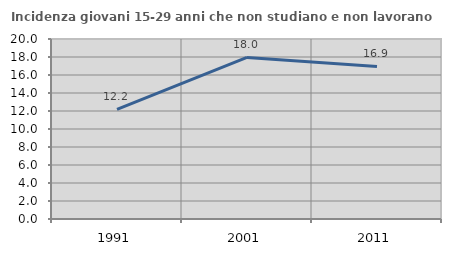
| Category | Incidenza giovani 15-29 anni che non studiano e non lavorano  |
|---|---|
| 1991.0 | 12.174 |
| 2001.0 | 17.953 |
| 2011.0 | 16.946 |